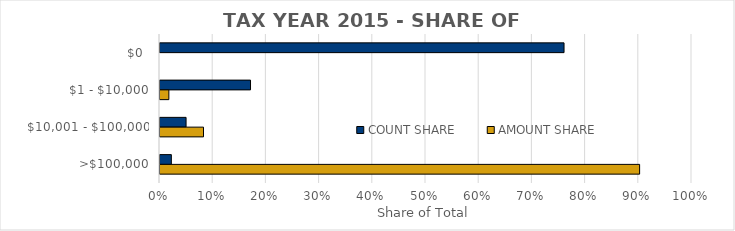
| Category | COUNT SHARE | AMOUNT SHARE |
|---|---|---|
| $0  | 0.759 | 0 |
| $1 - $10,000 | 0.17 | 0.017 |
| $10,001 - $100,000 | 0.049 | 0.082 |
| >$100,000 | 0.021 | 0.902 |